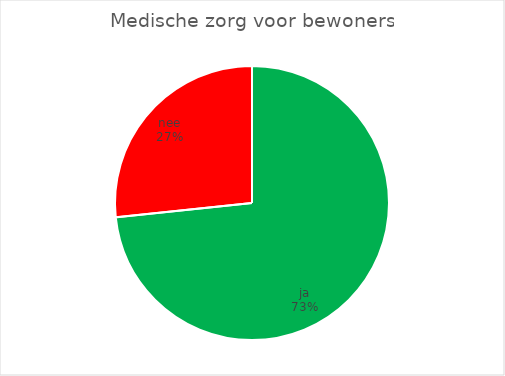
| Category | Medische zorg voor bewoners |
|---|---|
| ja | 11 |
| nee | 4 |